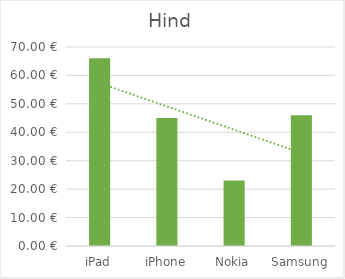
| Category | Hind |
|---|---|
| iPad | 66 |
| iPhone | 45 |
| Nokia | 23 |
| Samsung | 46 |